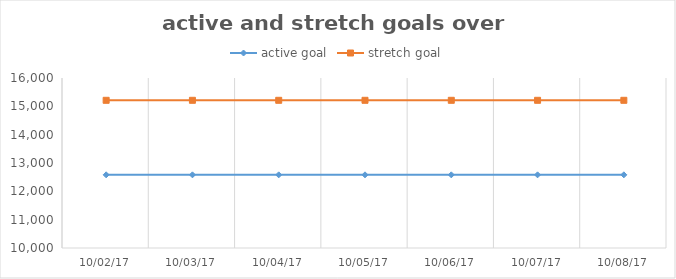
| Category | active goal | stretch goal |
|---|---|---|
| 2017-10-02 | 12582 | 15213 |
| 2017-10-03 | 12582 | 15213 |
| 2017-10-04 | 12582 | 15213 |
| 2017-10-05 | 12582 | 15213 |
| 2017-10-06 | 12582 | 15213 |
| 2017-10-07 | 12582 | 15213 |
| 2017-10-08 | 12582 | 15213 |